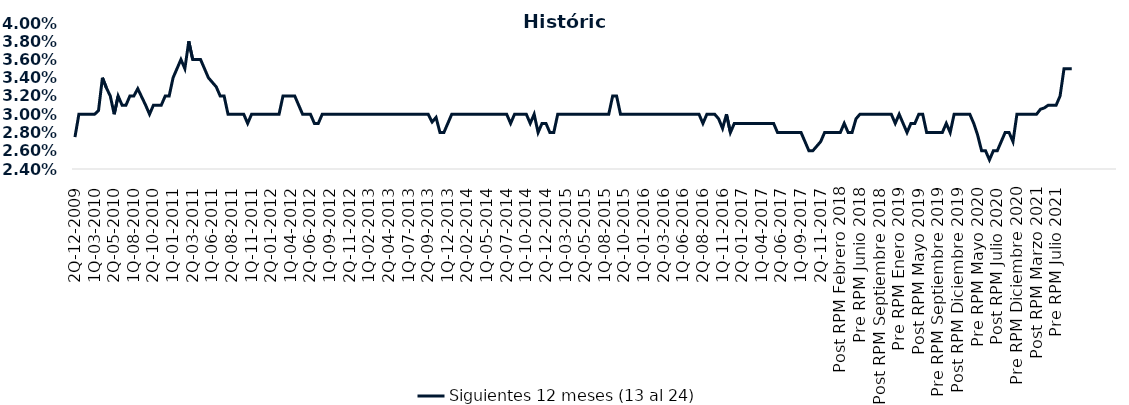
| Category | Siguientes 12 meses (13 al 24)  |
|---|---|
| 2Q-12-2009 | 0.028 |
| 1Q-01-2010 | 0.03 |
| 2Q-01-2010 | 0.03 |
| 1Q-02-2010 | 0.03 |
| 2Q-02-2010 | 0.03 |
| 1Q-03-2010 | 0.03 |
| 2Q-03-2010 | 0.03 |
| 1Q-04-2010 | 0.034 |
| 2Q-04-2010 | 0.033 |
| 1Q-05-2010 | 0.032 |
| 2Q-05-2010 | 0.03 |
| 1Q-06-2010 | 0.032 |
| 2Q-06-2010 | 0.031 |
| 1Q-07-2010 | 0.031 |
| 2Q-07-2010 | 0.032 |
| 1Q-08-2010 | 0.032 |
| 2Q-08-2010 | 0.033 |
| 1Q-09-2010 | 0.032 |
| 2Q-09-2010 | 0.031 |
| 1Q-10-2010 | 0.03 |
| 2Q-10-2010 | 0.031 |
| 1Q-11-2010 | 0.031 |
| 2Q-11-2010 | 0.031 |
| 1Q-12-2010 | 0.032 |
| 2Q-12-2010 | 0.032 |
| 1Q-01-2011 | 0.034 |
| 2Q-01-2011 | 0.035 |
| 1Q-02-2011 | 0.036 |
| 2Q-02-2011 | 0.035 |
| 1Q-03-2011 | 0.038 |
| 2Q-03-2011 | 0.036 |
| 1Q-04-2011 | 0.036 |
| 2Q-04-2011 | 0.036 |
| 1Q-05-2011 | 0.035 |
| 2Q-05-2011 | 0.034 |
| 1Q-06-2011 | 0.034 |
| 2Q-06-2011 | 0.033 |
| 1Q-07-2011 | 0.032 |
| 2Q-07-2011 | 0.032 |
| 1Q-08-2011 | 0.03 |
| 2Q-08-2011 | 0.03 |
| 1Q-09-2011 | 0.03 |
| 2Q-09-2011 | 0.03 |
| 1Q-10-2011 | 0.03 |
| 2Q-10-2012 | 0.029 |
| 1Q-11-2011 | 0.03 |
| 2Q-11-2011 | 0.03 |
| 1Q-12-2011 | 0.03 |
| 2Q-12-2011 | 0.03 |
| 1Q-01-2012 | 0.03 |
| 2Q-01-2012 | 0.03 |
| 1Q-02-2012 | 0.03 |
| 2Q-02-2012 | 0.03 |
| 1Q-03-2012 | 0.032 |
| 2Q-03-2012 | 0.032 |
| 1Q-04-2012 | 0.032 |
| 2Q-04-2012 | 0.032 |
| 1Q-05-2012 | 0.031 |
| 2Q-05-2012 | 0.03 |
| 1Q-06-2012 | 0.03 |
| 2Q-06-2012 | 0.03 |
| 1Q-07-2012 | 0.029 |
| 2Q-07-2012 | 0.029 |
| 1Q-08-2012 | 0.03 |
| 2Q-08-2012 | 0.03 |
| 1Q-09-2012 | 0.03 |
| 2Q-09-2012 | 0.03 |
| 1Q-10-2012 | 0.03 |
| 2Q-10-2012 | 0.03 |
| 1Q-11-2012 | 0.03 |
| 2Q-11-2012 | 0.03 |
| 1Q-12-2012 | 0.03 |
| 2Q-12-2012 | 0.03 |
| 1Q-01-2013 | 0.03 |
| 2Q-01-2013 | 0.03 |
| 1Q-02-2013 | 0.03 |
| 2Q-02-2013 | 0.03 |
| 1Q-03-2013 | 0.03 |
| 2Q-03-2013 | 0.03 |
| 1Q-04-2013 | 0.03 |
| 2Q-04-2013 | 0.03 |
| 1Q-05-2013 | 0.03 |
| 2Q-05-2013 | 0.03 |
| 1Q-06-2013 | 0.03 |
| 2Q-06-2013 | 0.03 |
| 1Q-07-2013 | 0.03 |
| 2Q-07-2013 | 0.03 |
| 1Q-08-2013 | 0.03 |
| 2Q-08-2013 | 0.03 |
| 1Q-09-2013 | 0.03 |
| 2Q-09-2013 | 0.03 |
| 1Q-10-2013 | 0.029 |
| 2Q-10-2013 | 0.03 |
| 1Q-11-2013 | 0.028 |
| 2Q-11-2013 | 0.028 |
| 1Q-12-2013 | 0.029 |
| 2Q-12-2013 | 0.03 |
| 1Q-01-2014 | 0.03 |
| 2Q-01-2014 | 0.03 |
| 1Q-02-2014 | 0.03 |
| 2Q-02-2014 | 0.03 |
| 1Q-03-2014 | 0.03 |
| 2Q-03-2014 | 0.03 |
| 1Q-04-2014 | 0.03 |
| 2Q-04-2014 | 0.03 |
| 1Q-05-2014 | 0.03 |
| 2Q-05-2014 | 0.03 |
| 1Q-06-2014 | 0.03 |
| 2Q-06-2014 | 0.03 |
| 1Q-07-2014 | 0.03 |
| 2Q-07-2014 | 0.03 |
| 1Q-08-2014 | 0.029 |
| 2Q-08-2014 | 0.03 |
| 1Q-09-2014 | 0.03 |
| 2Q-09-2014 | 0.03 |
| 1Q-10-2014 | 0.03 |
| 2Q-10-2014 | 0.029 |
| 1Q-11-2014 | 0.03 |
| 2Q-11-2014 | 0.028 |
| 1Q-12-2014 | 0.029 |
| 2Q-12-2014 | 0.029 |
| 1Q-01-2015 | 0.028 |
| 2Q-01-2015 | 0.028 |
| 1Q-02-2015 | 0.03 |
| 2Q-02-2015 | 0.03 |
| 1Q-03-2015 | 0.03 |
| 2Q-03-2015 | 0.03 |
| 1Q-04-2015 | 0.03 |
| 2Q-04-2015 | 0.03 |
| 1Q-05-2015 | 0.03 |
| 2Q-05-2015 | 0.03 |
| 1Q-06-2015 | 0.03 |
| 2Q-06-2015 | 0.03 |
| 1Q-07-2015 | 0.03 |
| 2Q-07-2015 | 0.03 |
| 1Q-08-2015 | 0.03 |
| 2Q-08-2015 | 0.03 |
| 1Q-09-2015 | 0.032 |
| 2Q-09-2015 | 0.032 |
| 1Q-10-2015 | 0.03 |
| 2Q-10-2015 | 0.03 |
| 1Q-11-2015 | 0.03 |
| 2Q-11-2015 | 0.03 |
| 1Q-12-2015 | 0.03 |
| 2Q-12-2015 | 0.03 |
| 1Q-01-2016 | 0.03 |
| 2Q-01-2016 | 0.03 |
| 1Q-02-2016 | 0.03 |
| 2Q-02-2016 | 0.03 |
| 1Q-03-2016 | 0.03 |
| 2Q-03-2016 | 0.03 |
| 1Q-04-2016 | 0.03 |
| 2Q-04-2016 | 0.03 |
| 1Q-05-2016 | 0.03 |
| 2Q-05-2016 | 0.03 |
| 1Q-06-2016 | 0.03 |
| 2Q-06-2016 | 0.03 |
| 1Q-07-2016 | 0.03 |
| 2Q-07-2016 | 0.03 |
| 1Q-08-2016 | 0.03 |
| 2Q-08-2016 | 0.029 |
| 1Q-09-2016 | 0.03 |
| 2Q-09-2016 | 0.03 |
| 1Q-10-2016 | 0.03 |
| 2Q-10-2016 | 0.03 |
| 1Q-11-2016 | 0.028 |
| 2Q-11-2016 | 0.03 |
| 1Q-12-2016 | 0.028 |
| 2Q-12-2016 | 0.029 |
| 1Q-01-2017 | 0.029 |
| 2Q-01-2017 | 0.029 |
| 1Q-02-2017 | 0.029 |
| 2Q-02-2017 | 0.029 |
| 1Q-03-2017 | 0.029 |
| 2Q-03-2017 | 0.029 |
| 1Q-04-2017 | 0.029 |
| 2Q-04-2017 | 0.029 |
| 1Q-05-2017 | 0.029 |
| 2Q-05-2017 | 0.029 |
| 1Q-06-2017 | 0.028 |
| 2Q-06-2017 | 0.028 |
| 1Q-07-2017 | 0.028 |
| 2Q-07-2017 | 0.028 |
| 1Q-08-2017 | 0.028 |
| 2Q-08-2017 | 0.028 |
| 1Q-09-2017 | 0.028 |
| 2Q-09-2017 | 0.027 |
| 1Q-10-2017 | 0.026 |
| 2Q-10-2017 | 0.026 |
| 1Q-11-2017 | 0.026 |
| 2Q-11-2017 | 0.027 |
| 1Q-12-2017 | 0.028 |
| 2Q-12-2017 | 0.028 |
| 1Q-01-2018 | 0.028 |
| 2Q-01-2018 | 0.028 |
| Post RPM Febrero 2018 | 0.028 |
| Pre RPM Marzo 2018 | 0.029 |
| Post RPM Marzo 2018 | 0.028 |
| Pre RPM Mayo 2018 | 0.028 |
| Post RPM Mayo 2018 | 0.03 |
| Pre RPM Junio 2018 | 0.03 |
| Post RPM Junio 2018 | 0.03 |
| Pre RPM Julio 2018 | 0.03 |
| Post RPM Julio 2018 | 0.03 |
| Pre RPM Septiembre 2018 | 0.03 |
| Post RPM Septiembre 2018 | 0.03 |
| Pre RPM Octubre 2018 | 0.03 |
| Post RPM Octubre 2018 | 0.03 |
| Pre RPM Diciembre 2018 | 0.03 |
| Post RPM Diciembre 2018 | 0.029 |
| Pre RPM Enero 2019 | 0.03 |
| Post RPM Enero 2019 | 0.029 |
| Pre RPM Marzo 2019 | 0.028 |
| Post RPM Marzo 2019 | 0.029 |
| Pre RPM Mayo 2019 | 0.029 |
| Post RPM Mayo 2019 | 0.03 |
| Pre RPM Junio 2019 | 0.03 |
| Post RPM Junio 2019 | 0.028 |
| Pre RPM Julio 2019 | 0.028 |
| Post RPM Julio 2019 | 0.028 |
| Pre RPM Septiembre 2019 | 0.028 |
| Post RPM Septiembre 2019 | 0.028 |
| Pre RPM Octubre 2019 | 0.029 |
| Post RPM Octubre 2019 | 0.028 |
| Pre RPM Diciembre 2019 | 0.03 |
| Post RPM Diciembre 2019 | 0.03 |
| Pre RPM Enero 2020 | 0.03 |
| Post RPM Enero 2020 | 0.03 |
| Pre RPM Marzo 2020 | 0.03 |
| Post RPM Marzo 2020 | 0.029 |
| Pre RPM Mayo 2020 | 0.028 |
| Post RPM Mayo 2020 | 0.026 |
| Pre RPM Junio 2020 | 0.026 |
| Post RPM Junio 2020 | 0.025 |
| Pre RPM Julio 2020 | 0.026 |
| Post RPM Julio 2020 | 0.026 |
| Pre RPM Septiembre 2020 | 0.027 |
| Post RPM Septiembre 2020 | 0.028 |
| Pre RPM Octubre 2020 | 0.028 |
| Post RPM Octubre 2020 | 0.027 |
| Pre RPM Diciembre 2020 | 0.03 |
| Post RPM Diciembre 2020 | 0.03 |
| Pre RPM Enero 2021 | 0.03 |
| Post RPM Enero 2021 | 0.03 |
| Pre RPM Marzo 2021 | 0.03 |
| Post RPM Marzo 2021 | 0.03 |
| Pre RPM Mayo 2021 | 0.031 |
| Post RPM Mayo 2021 | 0.031 |
| Pre RPM Junio 2021 | 0.031 |
| Post RPM Junio 2021 | 0.031 |
| Pre RPM Julio 2021 | 0.031 |
| Post RPM Julio 2021 | 0.032 |
| Pre RPM Agosto 2021 | 0.035 |
| Post RPM Agosto 2021 | 0.035 |
| Pre RPM Octubre 2021 | 0.035 |